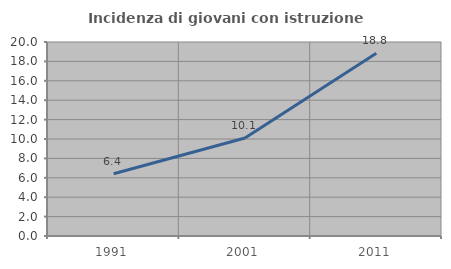
| Category | Incidenza di giovani con istruzione universitaria |
|---|---|
| 1991.0 | 6.41 |
| 2001.0 | 10.105 |
| 2011.0 | 18.828 |